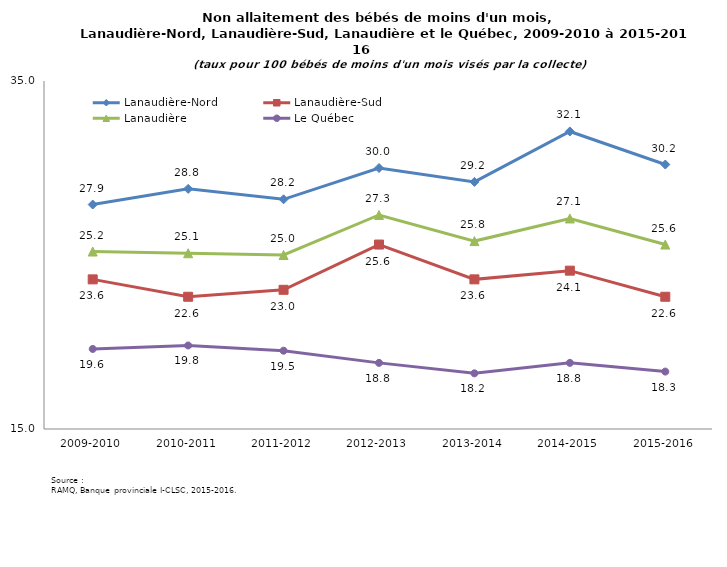
| Category | Lanaudière-Nord | Lanaudière-Sud | Lanaudière | Le Québec |
|---|---|---|---|---|
| 2009-2010 | 27.9 | 23.6 | 25.2 | 19.6 |
| 2010-2011 | 28.8 | 22.6 | 25.1 | 19.8 |
| 2011-2012 | 28.2 | 23 | 25 | 19.5 |
| 2012-2013 | 30 | 25.6 | 27.3 | 18.8 |
| 2013-2014 | 29.2 | 23.6 | 25.8 | 18.2 |
| 2014-2015 | 32.1 | 24.1 | 27.1 | 18.8 |
| 2015-2016 | 30.2 | 22.6 | 25.6 | 18.3 |